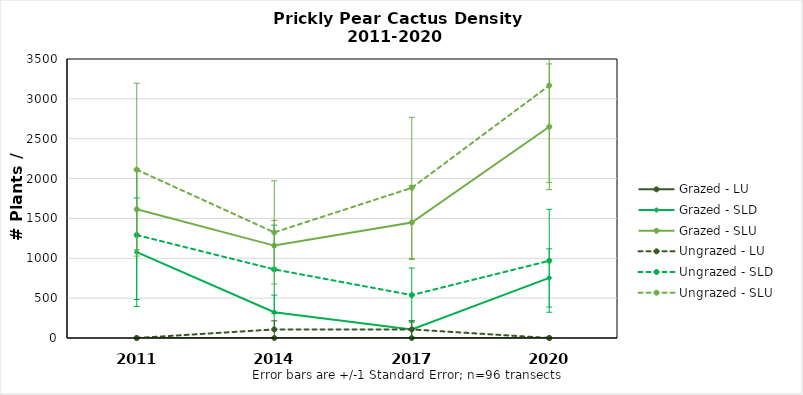
| Category | Grazed - LU | Grazed - SLD | Grazed - SLU | Ungrazed - LU | Ungrazed - SLD | Ungrazed - SLU |
|---|---|---|---|---|---|---|
| 2011.0 | 0 | 1076.39 | 1614.585 | 0 | 1291.668 | 2111.38 |
| 2014.0 | 0 | 322.917 | 1159.189 | 107.639 | 861.112 | 1324.788 |
| 2017.0 | 0 | 107.639 | 1448.987 | 107.639 | 538.195 | 1883.683 |
| 2020.0 | 0 | 753.473 | 2649.575 | 0 | 968.751 | 3167.071 |